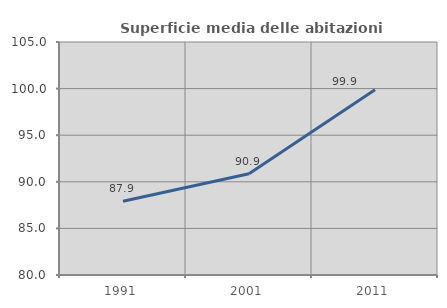
| Category | Superficie media delle abitazioni occupate |
|---|---|
| 1991.0 | 87.92 |
| 2001.0 | 90.863 |
| 2011.0 | 99.868 |